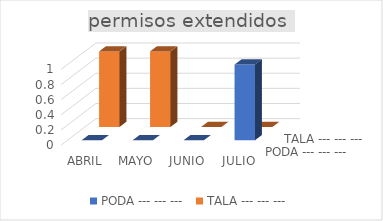
| Category | PODA | TALA |
|---|---|---|
| ABRIL | 0 | 1 |
| MAYO | 0 | 1 |
| JUNIO | 0 | 0 |
| JULIO | 1 | 0 |